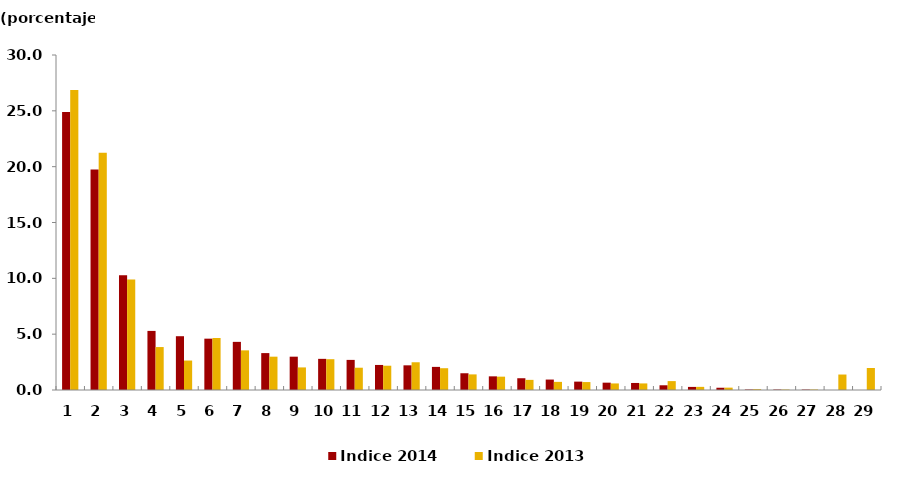
| Category | Indice 2014 | Indice 2013 |
|---|---|---|
| 1.0 | 24.897 | 26.877 |
| 2.0 | 19.737 | 21.236 |
| 3.0 | 10.284 | 9.906 |
| 4.0 | 5.292 | 3.846 |
| 5.0 | 4.816 | 2.638 |
| 6.0 | 4.597 | 4.659 |
| 7.0 | 4.311 | 3.55 |
| 8.0 | 3.304 | 2.984 |
| 9.0 | 2.984 | 2.022 |
| 10.0 | 2.79 | 2.758 |
| 11.0 | 2.696 | 1.996 |
| 12.0 | 2.243 | 2.174 |
| 13.0 | 2.209 | 2.484 |
| 14.0 | 2.07 | 1.951 |
| 15.0 | 1.5 | 1.398 |
| 16.0 | 1.223 | 1.195 |
| 17.0 | 1.053 | 0.908 |
| 18.0 | 0.935 | 0.728 |
| 19.0 | 0.75 | 0.71 |
| 20.0 | 0.656 | 0.588 |
| 21.0 | 0.63 | 0.589 |
| 22.0 | 0.423 | 0.796 |
| 23.0 | 0.276 | 0.282 |
| 24.0 | 0.202 | 0.212 |
| 25.0 | 0.043 | 0.073 |
| 26.0 | 0.04 | 0.04 |
| 27.0 | 0.039 | 0.045 |
| 28.0 | 0 | 1.386 |
| 29.0 | 0 | 1.971 |